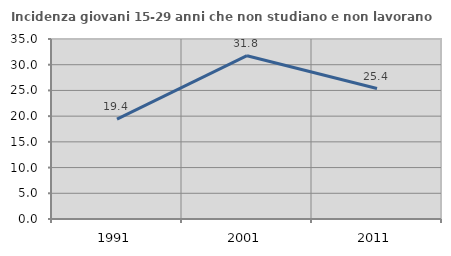
| Category | Incidenza giovani 15-29 anni che non studiano e non lavorano  |
|---|---|
| 1991.0 | 19.435 |
| 2001.0 | 31.755 |
| 2011.0 | 25.375 |